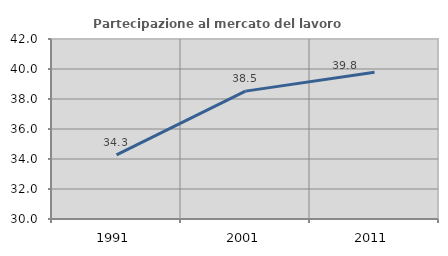
| Category | Partecipazione al mercato del lavoro  femminile |
|---|---|
| 1991.0 | 34.269 |
| 2001.0 | 38.525 |
| 2011.0 | 39.778 |